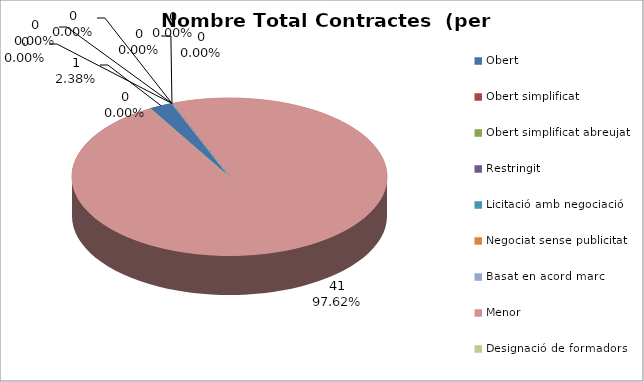
| Category | Nombre Total Contractes |
|---|---|
| Obert | 1 |
| Obert simplificat | 0 |
| Obert simplificat abreujat | 0 |
| Restringit | 0 |
| Licitació amb negociació | 0 |
| Negociat sense publicitat | 0 |
| Basat en acord marc | 0 |
| Menor | 41 |
| Designació de formadors | 0 |